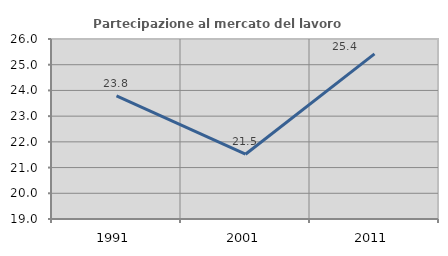
| Category | Partecipazione al mercato del lavoro  femminile |
|---|---|
| 1991.0 | 23.789 |
| 2001.0 | 21.519 |
| 2011.0 | 25.424 |